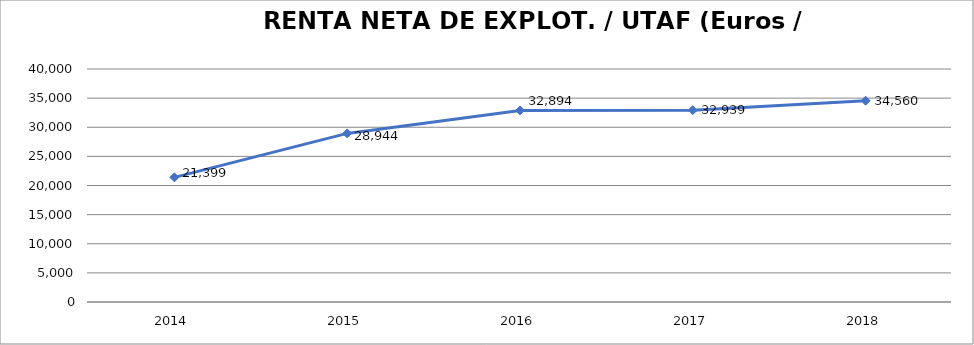
| Category | 2014 |
|---|---|
| 2014.0 | 21399.089 |
| 2015.0 | 28944.479 |
| 2016.0 | 32894.478 |
| 2017.0 | 32938.776 |
| 2018.0 | 34559.677 |